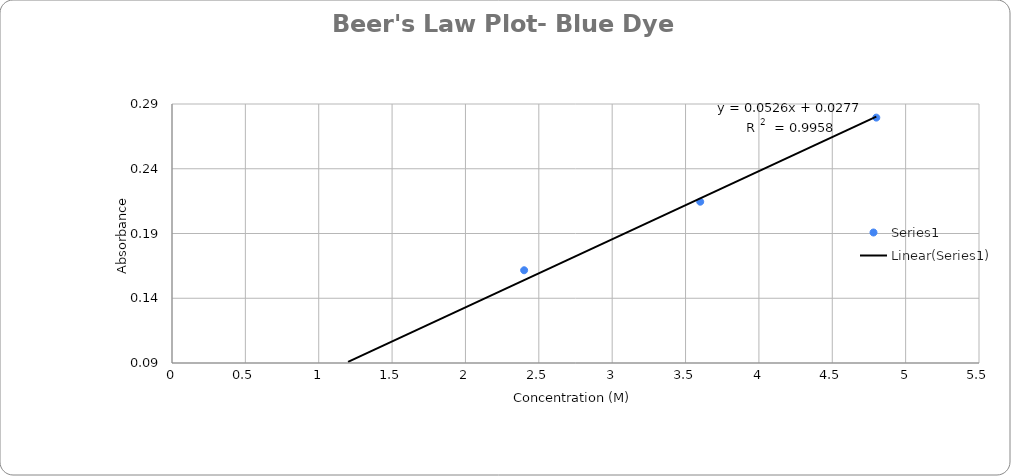
| Category | Series 0 |
|---|---|
| 1.2 | 0.087 |
| 2.4 | 0.162 |
| 3.6 | 0.215 |
| 4.8 | 0.279 |
| nan | 0.207 |